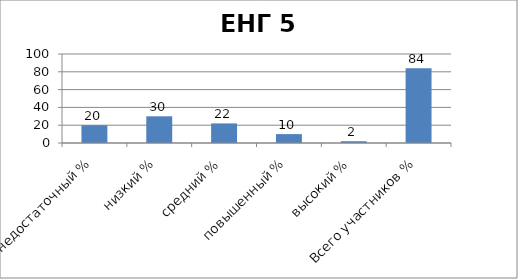
| Category | Series 0 |
|---|---|
| недостаточный % | 20 |
| низкий % | 30 |
| средний % | 22 |
| повышенный % | 10 |
| высокий % | 2 |
| Всего участников % | 84 |